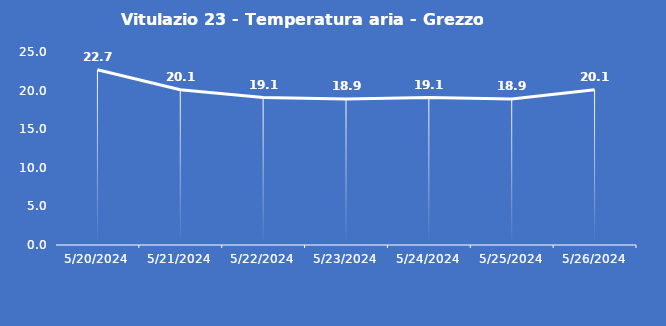
| Category | Vitulazio 23 - Temperatura aria - Grezzo (°C) |
|---|---|
| 5/20/24 | 22.7 |
| 5/21/24 | 20.1 |
| 5/22/24 | 19.1 |
| 5/23/24 | 18.9 |
| 5/24/24 | 19.1 |
| 5/25/24 | 18.9 |
| 5/26/24 | 20.1 |